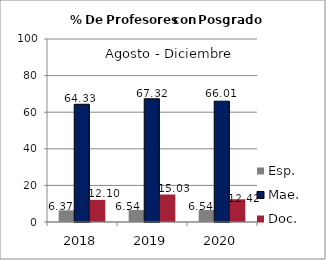
| Category | Esp. | Mae. | Doc. |
|---|---|---|---|
| 2018.0 | 6.37 | 64.33 | 12.1 |
| 2019.0 | 6.54 | 67.32 | 15.03 |
| 2020.0 | 6.54 | 66.01 | 12.42 |